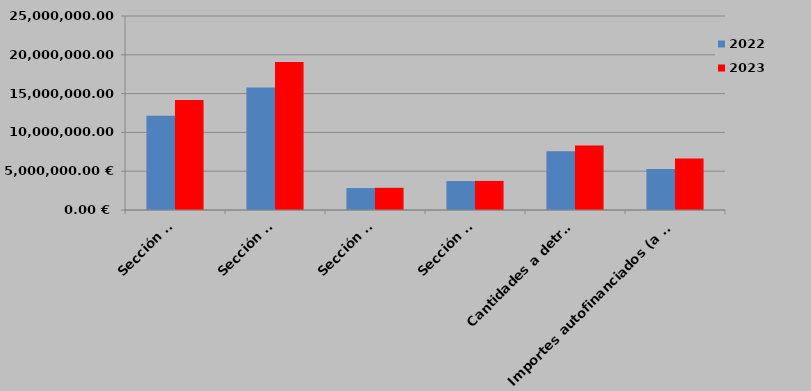
| Category | 2022 | 2023 |
|---|---|---|
| 0 | 12157700.557 | 14171068.84 |
| 1 | 15774491.71 | 19078529.47 |
| 2 | 2830558.25 | 2859060 |
| 3 | 3728485 | 3748643 |
| 4 | 7561873 | 8311861.49 |
| 5 | 5287262.19 | 6633055.17 |